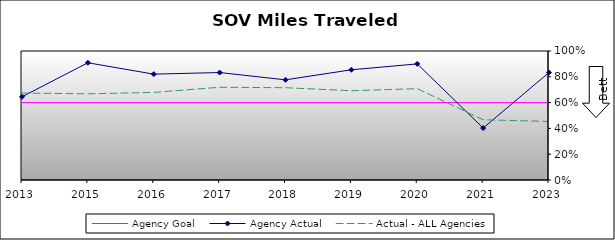
| Category | Agency Goal | Agency Actual | Actual - ALL Agencies |
|---|---|---|---|
| 2013.0 | 0.6 | 0.645 | 0.674 |
| 2015.0 | 0.6 | 0.909 | 0.668 |
| 2016.0 | 0.6 | 0.82 | 0.679 |
| 2017.0 | 0.6 | 0.833 | 0.719 |
| 2018.0 | 0.6 | 0.776 | 0.715 |
| 2019.0 | 0.6 | 0.854 | 0.692 |
| 2020.0 | 0.6 | 0.9 | 0.708 |
| 2021.0 | 0.6 | 0.403 | 0.467 |
| 2023.0 | 0.6 | 0.833 | 0.454 |